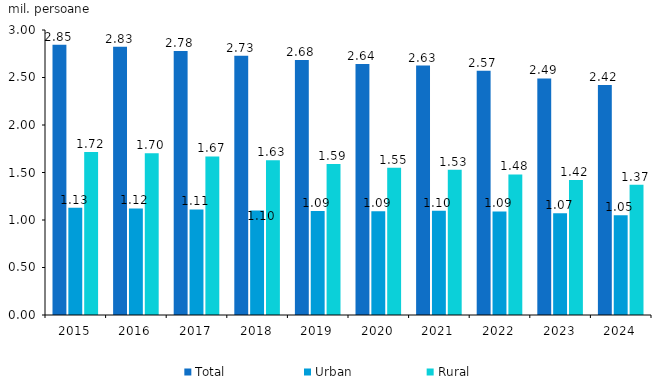
| Category | Total  | Urban | Rural |
|---|---|---|---|
| 2015.0 | 2.846 | 1.129 | 1.716 |
| 2016.0 | 2.825 | 1.122 | 1.702 |
| 2017.0 | 2.78 | 1.111 | 1.669 |
| 2018.0 | 2.729 | 1.1 | 1.628 |
| 2019.0 | 2.684 | 1.094 | 1.59 |
| 2020.0 | 2.643 | 1.092 | 1.55 |
| 2021.0 | 2.626 | 1.098 | 1.528 |
| 2022.0 | 2.57 | 1.09 | 1.48 |
| 2023.0 | 2.49 | 1.07 | 1.42 |
| 2024.0 | 2.42 | 1.05 | 1.37 |